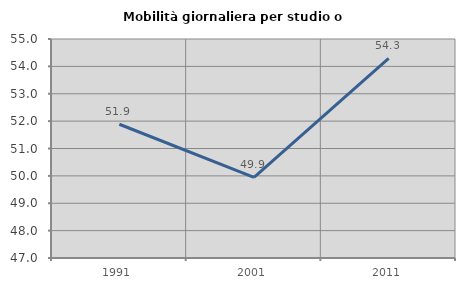
| Category | Mobilità giornaliera per studio o lavoro |
|---|---|
| 1991.0 | 51.886 |
| 2001.0 | 49.946 |
| 2011.0 | 54.296 |